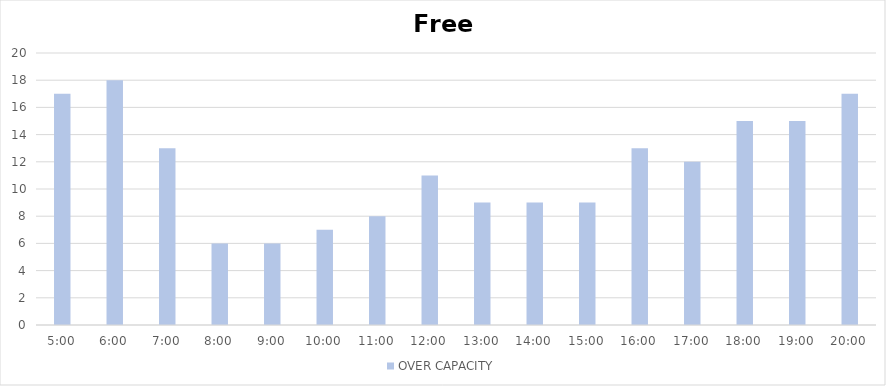
| Category | OVER CAPACITY |
|---|---|
| 0.20833333333333334 | 17 |
| 0.25 | 18 |
| 0.2916666666666667 | 13 |
| 0.3333333333333333 | 6 |
| 0.375 | 6 |
| 0.4166666666666667 | 7 |
| 0.4583333333333333 | 8 |
| 0.5 | 11 |
| 0.5416666666666666 | 9 |
| 0.5833333333333334 | 9 |
| 0.625 | 9 |
| 0.6666666666666666 | 13 |
| 0.7083333333333334 | 12 |
| 0.75 | 15 |
| 0.7916666666666666 | 15 |
| 0.8333333333333334 | 17 |